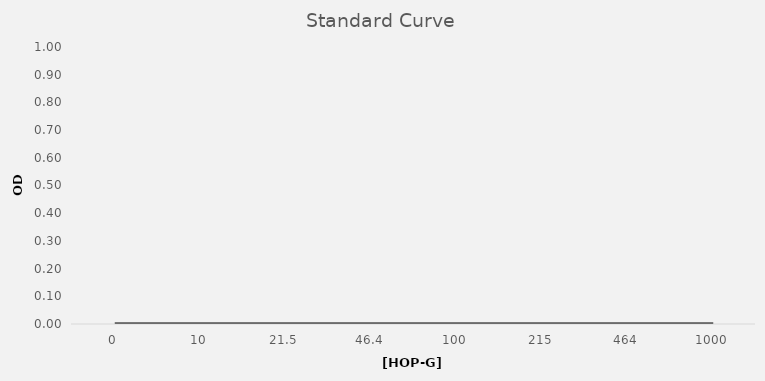
| Category | 1 |
|---|---|
| 0 | 0 |
| 1 | 0 |
| 2 | 0 |
| 3 | 0 |
| 4 | 0 |
| 5 | 0 |
| 6 | 0 |
| 7 | 0 |